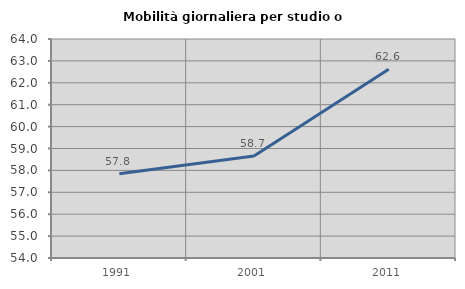
| Category | Mobilità giornaliera per studio o lavoro |
|---|---|
| 1991.0 | 57.846 |
| 2001.0 | 58.655 |
| 2011.0 | 62.621 |